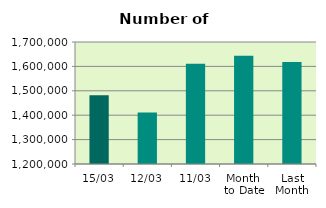
| Category | Series 0 |
|---|---|
| 15/03 | 1482092 |
| 12/03 | 1411174 |
| 11/03 | 1610778 |
| Month 
to Date | 1643307.636 |
| Last
Month | 1618522.4 |